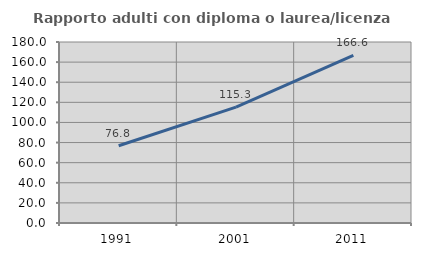
| Category | Rapporto adulti con diploma o laurea/licenza media  |
|---|---|
| 1991.0 | 76.8 |
| 2001.0 | 115.255 |
| 2011.0 | 166.646 |